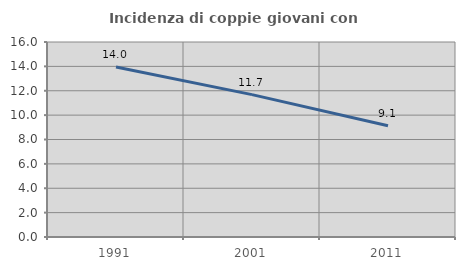
| Category | Incidenza di coppie giovani con figli |
|---|---|
| 1991.0 | 13.953 |
| 2001.0 | 11.682 |
| 2011.0 | 9.129 |